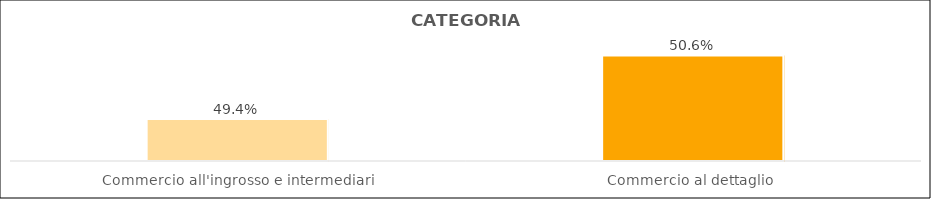
| Category | Series 0 |
|---|---|
| Commercio all'ingrosso e intermediari | 0.494 |
| Commercio al dettaglio  | 0.506 |